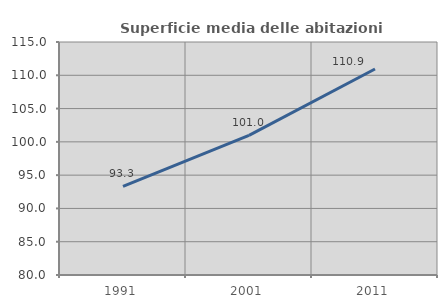
| Category | Superficie media delle abitazioni occupate |
|---|---|
| 1991.0 | 93.322 |
| 2001.0 | 100.978 |
| 2011.0 | 110.94 |